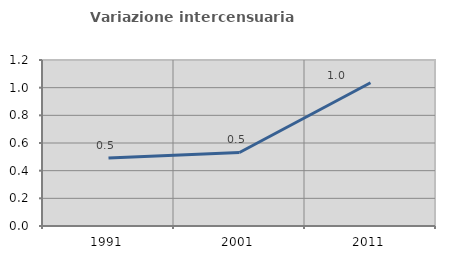
| Category | Variazione intercensuaria annua |
|---|---|
| 1991.0 | 0.491 |
| 2001.0 | 0.531 |
| 2011.0 | 1.036 |